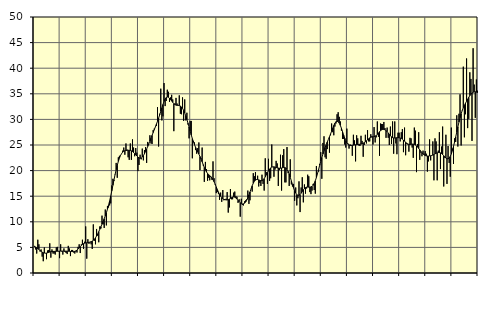
| Category | Piggar | Series 1 |
|---|---|---|
| nan | 5.1 | 5.25 |
| 87.0 | 4.6 | 5.07 |
| 87.0 | 3.8 | 4.92 |
| 87.0 | 6.5 | 4.76 |
| 87.0 | 5.6 | 4.6 |
| 87.0 | 4.2 | 4.42 |
| 87.0 | 4.6 | 4.23 |
| 87.0 | 3.2 | 4.08 |
| 87.0 | 2.3 | 3.96 |
| 87.0 | 5 | 3.9 |
| 87.0 | 3.9 | 3.87 |
| 87.0 | 2.7 | 3.89 |
| nan | 4.4 | 3.95 |
| 88.0 | 4.5 | 4.02 |
| 88.0 | 5.8 | 4.1 |
| 88.0 | 3 | 4.17 |
| 88.0 | 4.6 | 4.2 |
| 88.0 | 3.8 | 4.22 |
| 88.0 | 3.8 | 4.22 |
| 88.0 | 3.6 | 4.23 |
| 88.0 | 5 | 4.24 |
| 88.0 | 5.1 | 4.25 |
| 88.0 | 4.2 | 4.26 |
| 88.0 | 2.9 | 4.27 |
| nan | 5.6 | 4.28 |
| 89.0 | 4.2 | 4.29 |
| 89.0 | 3.6 | 4.28 |
| 89.0 | 4.8 | 4.27 |
| 89.0 | 4.1 | 4.27 |
| 89.0 | 3.9 | 4.27 |
| 89.0 | 3.7 | 4.26 |
| 89.0 | 5.3 | 4.25 |
| 89.0 | 4.8 | 4.24 |
| 89.0 | 3.3 | 4.21 |
| 89.0 | 4.5 | 4.19 |
| 89.0 | 4.5 | 4.18 |
| nan | 4 | 4.19 |
| 90.0 | 3.8 | 4.23 |
| 90.0 | 4.2 | 4.32 |
| 90.0 | 4 | 4.47 |
| 90.0 | 5.1 | 4.67 |
| 90.0 | 5.6 | 4.91 |
| 90.0 | 3.9 | 5.16 |
| 90.0 | 5.6 | 5.39 |
| 90.0 | 6.5 | 5.58 |
| 90.0 | 4.7 | 5.72 |
| 90.0 | 6.1 | 5.82 |
| 90.0 | 9.1 | 5.87 |
| nan | 2.8 | 5.91 |
| 91.0 | 6.6 | 5.94 |
| 91.0 | 5.7 | 5.99 |
| 91.0 | 6 | 6.04 |
| 91.0 | 5.6 | 6.12 |
| 91.0 | 4.7 | 6.23 |
| 91.0 | 9.5 | 6.38 |
| 91.0 | 6.3 | 6.6 |
| 91.0 | 5.6 | 6.88 |
| 91.0 | 8.6 | 7.23 |
| 91.0 | 7.3 | 7.63 |
| 91.0 | 6 | 8.08 |
| nan | 9.1 | 8.55 |
| 92.0 | 8.7 | 9.05 |
| 92.0 | 11.2 | 9.56 |
| 92.0 | 9.5 | 10.07 |
| 92.0 | 8.8 | 10.59 |
| 92.0 | 12.4 | 11.16 |
| 92.0 | 9.3 | 11.78 |
| 92.0 | 13.1 | 12.46 |
| 92.0 | 12.8 | 13.23 |
| 92.0 | 13.2 | 14.09 |
| 92.0 | 13.6 | 15.04 |
| 92.0 | 17.1 | 16.06 |
| nan | 18.4 | 17.13 |
| 93.0 | 18 | 18.2 |
| 93.0 | 19.3 | 19.22 |
| 93.0 | 21.5 | 20.17 |
| 93.0 | 18.6 | 21.04 |
| 93.0 | 22.6 | 21.79 |
| 93.0 | 22.9 | 22.43 |
| 93.0 | 22.9 | 22.95 |
| 93.0 | 23.3 | 23.33 |
| 93.0 | 23.9 | 23.61 |
| 93.0 | 24.5 | 23.79 |
| 93.0 | 23.1 | 23.88 |
| nan | 25.3 | 23.93 |
| 94.0 | 24.1 | 23.96 |
| 94.0 | 22.6 | 23.97 |
| 94.0 | 22.1 | 23.97 |
| 94.0 | 25.3 | 23.93 |
| 94.0 | 22.1 | 23.86 |
| 94.0 | 26.1 | 23.72 |
| 94.0 | 24.5 | 23.54 |
| 94.0 | 22.8 | 23.32 |
| 94.0 | 24.4 | 23.08 |
| 94.0 | 23.5 | 22.85 |
| 94.0 | 19.9 | 22.64 |
| nan | 21.1 | 22.48 |
| 95.0 | 23.1 | 22.42 |
| 95.0 | 22.2 | 22.46 |
| 95.0 | 24.3 | 22.64 |
| 95.0 | 22 | 22.92 |
| 95.0 | 24 | 23.29 |
| 95.0 | 24.6 | 23.72 |
| 95.0 | 21.5 | 24.2 |
| 95.0 | 25.6 | 24.72 |
| 95.0 | 25.1 | 25.24 |
| 95.0 | 26.9 | 25.77 |
| 95.0 | 25.3 | 26.32 |
| nan | 25.2 | 26.88 |
| 96.0 | 27.9 | 27.43 |
| 96.0 | 28.2 | 27.98 |
| 96.0 | 28.5 | 28.53 |
| 96.0 | 28.7 | 29.07 |
| 96.0 | 32.4 | 29.64 |
| 96.0 | 24.7 | 30.25 |
| 96.0 | 31.1 | 30.89 |
| 96.0 | 36 | 31.56 |
| 96.0 | 29.8 | 32.24 |
| 96.0 | 30.6 | 32.91 |
| 96.0 | 37.1 | 33.51 |
| nan | 32.6 | 33.97 |
| 97.0 | 33.6 | 34.27 |
| 97.0 | 35.8 | 34.38 |
| 97.0 | 35.4 | 34.32 |
| 97.0 | 33.4 | 34.14 |
| 97.0 | 34.3 | 33.88 |
| 97.0 | 34.8 | 33.59 |
| 97.0 | 33.9 | 33.33 |
| 97.0 | 27.7 | 33.08 |
| 97.0 | 33.1 | 32.89 |
| 97.0 | 34.2 | 32.79 |
| 97.0 | 33.1 | 32.75 |
| nan | 32.8 | 32.74 |
| 98.0 | 34.7 | 32.7 |
| 98.0 | 31.1 | 32.61 |
| 98.0 | 31 | 32.44 |
| 98.0 | 34.3 | 32.16 |
| 98.0 | 29.7 | 31.76 |
| 98.0 | 33.9 | 31.26 |
| 98.0 | 29.8 | 30.65 |
| 98.0 | 31.3 | 29.98 |
| 98.0 | 29 | 29.26 |
| 98.0 | 26.3 | 28.51 |
| 98.0 | 29.7 | 27.74 |
| nan | 29.7 | 26.97 |
| 99.0 | 22.4 | 26.26 |
| 99.0 | 25.8 | 25.61 |
| 99.0 | 25.5 | 25.05 |
| 99.0 | 24 | 24.54 |
| 99.0 | 23.3 | 24.08 |
| 99.0 | 24.4 | 23.65 |
| 99.0 | 25.5 | 23.22 |
| 99.0 | 20.1 | 22.76 |
| 99.0 | 22.4 | 22.26 |
| 99.0 | 24.5 | 21.72 |
| 99.0 | 21 | 21.16 |
| nan | 17.8 | 20.61 |
| 0.0 | 21.7 | 20.13 |
| 0.0 | 20.3 | 19.74 |
| 0.0 | 18 | 19.44 |
| 0.0 | 18.6 | 19.21 |
| 0.0 | 18.1 | 19.01 |
| 0.0 | 18.9 | 18.8 |
| 0.0 | 18.2 | 18.54 |
| 0.0 | 21.8 | 18.21 |
| 0.0 | 18.5 | 17.81 |
| 0.0 | 17.2 | 17.33 |
| 0.0 | 15.6 | 16.8 |
| nan | 15.8 | 16.29 |
| 1.0 | 15.4 | 15.8 |
| 1.0 | 14.3 | 15.36 |
| 1.0 | 15.7 | 15 |
| 1.0 | 13.9 | 14.72 |
| 1.0 | 16.2 | 14.52 |
| 1.0 | 14.2 | 14.4 |
| 1.0 | 14.3 | 14.32 |
| 1.0 | 14.5 | 14.28 |
| 1.0 | 15.8 | 14.27 |
| 1.0 | 11.8 | 14.33 |
| 1.0 | 12.8 | 14.44 |
| nan | 16.4 | 14.58 |
| 2.0 | 14.4 | 14.72 |
| 2.0 | 14.4 | 14.82 |
| 2.0 | 15.7 | 14.86 |
| 2.0 | 15.9 | 14.81 |
| 2.0 | 15 | 14.66 |
| 2.0 | 14.9 | 14.44 |
| 2.0 | 13.7 | 14.18 |
| 2.0 | 14.4 | 13.92 |
| 2.0 | 11 | 13.7 |
| 2.0 | 14.5 | 13.55 |
| 2.0 | 13.3 | 13.48 |
| nan | 13.2 | 13.51 |
| 3.0 | 14 | 13.63 |
| 3.0 | 14.2 | 13.87 |
| 3.0 | 14.4 | 14.23 |
| 3.0 | 16.1 | 14.69 |
| 3.0 | 13.5 | 15.24 |
| 3.0 | 14.2 | 15.83 |
| 3.0 | 16.4 | 16.44 |
| 3.0 | 15.9 | 17.03 |
| 3.0 | 19.5 | 17.53 |
| 3.0 | 18.9 | 17.91 |
| 3.0 | 19.7 | 18.15 |
| nan | 18.2 | 18.25 |
| 4.0 | 19 | 18.25 |
| 4.0 | 16.9 | 18.19 |
| 4.0 | 17.6 | 18.1 |
| 4.0 | 17 | 18.03 |
| 4.0 | 19.2 | 18.05 |
| 4.0 | 17.4 | 18.19 |
| 4.0 | 16.1 | 18.44 |
| 4.0 | 22.4 | 18.78 |
| 4.0 | 19.7 | 19.18 |
| 4.0 | 17.4 | 19.6 |
| 4.0 | 22.3 | 19.97 |
| nan | 18 | 20.3 |
| 5.0 | 18.5 | 20.54 |
| 5.0 | 25.1 | 20.68 |
| 5.0 | 20.7 | 20.73 |
| 5.0 | 18.8 | 20.73 |
| 5.0 | 20.2 | 20.69 |
| 5.0 | 21.9 | 20.61 |
| 5.0 | 21.4 | 20.55 |
| 5.0 | 17 | 20.5 |
| 5.0 | 20.1 | 20.46 |
| 5.0 | 23.1 | 20.47 |
| 5.0 | 16.1 | 20.51 |
| nan | 23 | 20.57 |
| 6.0 | 24.2 | 20.62 |
| 6.0 | 17.7 | 20.61 |
| 6.0 | 17.7 | 20.49 |
| 6.0 | 24.6 | 20.24 |
| 6.0 | 19.5 | 19.86 |
| 6.0 | 17 | 19.34 |
| 6.0 | 22.2 | 18.69 |
| 6.0 | 17.3 | 17.99 |
| 6.0 | 16.9 | 17.29 |
| 6.0 | 17.4 | 16.63 |
| 6.0 | 14.1 | 16.07 |
| nan | 16.7 | 15.63 |
| 7.0 | 13.2 | 15.31 |
| 7.0 | 14.6 | 15.15 |
| 7.0 | 17.9 | 15.17 |
| 7.0 | 11.9 | 15.34 |
| 7.0 | 16.7 | 15.59 |
| 7.0 | 18.7 | 15.91 |
| 7.0 | 13.8 | 16.23 |
| 7.0 | 17.3 | 16.49 |
| 7.0 | 15.5 | 16.67 |
| 7.0 | 16.5 | 16.77 |
| 7.0 | 19.2 | 16.79 |
| nan | 18.9 | 16.77 |
| 8.0 | 15.8 | 16.76 |
| 8.0 | 15.4 | 16.81 |
| 8.0 | 16.1 | 16.92 |
| 8.0 | 17.4 | 17.14 |
| 8.0 | 16.2 | 17.5 |
| 8.0 | 15.5 | 18.01 |
| 8.0 | 20.9 | 18.65 |
| 8.0 | 19.5 | 19.4 |
| 8.0 | 19.8 | 20.21 |
| 8.0 | 21.3 | 21.03 |
| 8.0 | 23.6 | 21.82 |
| nan | 18.4 | 22.55 |
| 9.0 | 25.4 | 23.24 |
| 9.0 | 26.7 | 23.9 |
| 9.0 | 22.6 | 24.51 |
| 9.0 | 22.3 | 25.07 |
| 9.0 | 24.2 | 25.59 |
| 9.0 | 26.1 | 26.1 |
| 9.0 | 23.5 | 26.61 |
| 9.0 | 26.9 | 27.14 |
| 9.0 | 29.2 | 27.71 |
| 9.0 | 27.5 | 28.28 |
| 9.0 | 26.9 | 28.82 |
| nan | 28.6 | 29.26 |
| 10.0 | 29.2 | 29.56 |
| 10.0 | 31 | 29.65 |
| 10.0 | 31.4 | 29.55 |
| 10.0 | 30.5 | 29.26 |
| 10.0 | 29.6 | 28.83 |
| 10.0 | 27.8 | 28.27 |
| 10.0 | 26.2 | 27.63 |
| 10.0 | 26.2 | 26.97 |
| 10.0 | 25.1 | 26.35 |
| 10.0 | 24.5 | 25.82 |
| 10.0 | 28.2 | 25.41 |
| nan | 25.3 | 25.15 |
| 11.0 | 24.3 | 24.99 |
| 11.0 | 25.1 | 24.92 |
| 11.0 | 25 | 24.91 |
| 11.0 | 22.9 | 24.93 |
| 11.0 | 27 | 24.97 |
| 11.0 | 25.9 | 25.01 |
| 11.0 | 21.8 | 25.04 |
| 11.0 | 26.9 | 25.07 |
| 11.0 | 26.3 | 25.1 |
| 11.0 | 24.9 | 25.12 |
| 11.0 | 24.8 | 25.15 |
| nan | 26.8 | 25.18 |
| 12.0 | 25.8 | 25.24 |
| 12.0 | 22.7 | 25.34 |
| 12.0 | 25 | 25.48 |
| 12.0 | 27 | 25.64 |
| 12.0 | 25.3 | 25.82 |
| 12.0 | 27.9 | 26.01 |
| 12.0 | 25.7 | 26.21 |
| 12.0 | 25.7 | 26.39 |
| 12.0 | 27.1 | 26.5 |
| 12.0 | 26.7 | 26.57 |
| 12.0 | 25.1 | 26.6 |
| nan | 28.5 | 26.64 |
| 13.0 | 25.5 | 26.72 |
| 13.0 | 26.5 | 26.86 |
| 13.0 | 29.6 | 27.08 |
| 13.0 | 26.6 | 27.34 |
| 13.0 | 22.9 | 27.59 |
| 13.0 | 29.2 | 27.81 |
| 13.0 | 29.1 | 27.97 |
| 13.0 | 29.1 | 28.05 |
| 13.0 | 29.5 | 28.05 |
| 13.0 | 28.3 | 27.96 |
| 13.0 | 26.4 | 27.82 |
| nan | 28.4 | 27.6 |
| 14.0 | 26.4 | 27.35 |
| 14.0 | 25 | 27.08 |
| 14.0 | 28.6 | 26.81 |
| 14.0 | 25.2 | 26.58 |
| 14.0 | 29.6 | 26.44 |
| 14.0 | 23.3 | 26.38 |
| 14.0 | 29.6 | 26.37 |
| 14.0 | 25.3 | 26.39 |
| 14.0 | 23.2 | 26.42 |
| 14.0 | 27.4 | 26.44 |
| 14.0 | 27.4 | 26.42 |
| nan | 25.7 | 26.36 |
| 15.0 | 27.5 | 26.28 |
| 15.0 | 28.1 | 26.14 |
| 15.0 | 23.6 | 25.95 |
| 15.0 | 28.4 | 25.74 |
| 15.0 | 23 | 25.54 |
| 15.0 | 25.2 | 25.35 |
| 15.0 | 25.1 | 25.21 |
| 15.0 | 23.7 | 25.12 |
| 15.0 | 26.4 | 25.11 |
| 15.0 | 26.3 | 25.15 |
| 15.0 | 24.5 | 25.18 |
| nan | 22.5 | 25.17 |
| 16.0 | 28.4 | 25.11 |
| 16.0 | 27.8 | 24.99 |
| 16.0 | 19.7 | 24.82 |
| 16.0 | 25.2 | 24.6 |
| 16.0 | 27.5 | 24.33 |
| 16.0 | 22.1 | 24.05 |
| 16.0 | 23.5 | 23.75 |
| 16.0 | 22.8 | 23.49 |
| 16.0 | 23.9 | 23.27 |
| 16.0 | 23.3 | 23.08 |
| 16.0 | 23.8 | 22.94 |
| nan | 23.3 | 22.88 |
| 17.0 | 19.8 | 22.85 |
| 17.0 | 21.8 | 22.84 |
| 17.0 | 26.1 | 22.87 |
| 17.0 | 22 | 22.9 |
| 17.0 | 22.9 | 22.96 |
| 17.0 | 25.7 | 23.04 |
| 17.0 | 18.1 | 23.14 |
| 17.0 | 26.3 | 23.26 |
| 17.0 | 25.7 | 23.38 |
| 17.0 | 18.1 | 23.46 |
| 17.0 | 23.9 | 23.53 |
| nan | 27.5 | 23.53 |
| 18.0 | 20.3 | 23.46 |
| 18.0 | 24.7 | 23.33 |
| 18.0 | 28.6 | 23.15 |
| 18.0 | 16.9 | 22.91 |
| 18.0 | 22.5 | 22.66 |
| 18.0 | 27 | 22.45 |
| 18.0 | 17.4 | 22.32 |
| 18.0 | 24.8 | 22.3 |
| 18.0 | 21.5 | 22.43 |
| 18.0 | 18.8 | 22.77 |
| 18.0 | 28.4 | 23.27 |
| nan | 24.3 | 23.92 |
| 19.0 | 21.3 | 24.73 |
| 19.0 | 26.3 | 25.61 |
| 19.0 | 25.6 | 26.56 |
| 19.0 | 30.8 | 27.55 |
| 19.0 | 24.7 | 28.55 |
| 19.0 | 31.1 | 29.47 |
| 19.0 | 34.9 | 30.33 |
| 19.0 | 24.9 | 31.1 |
| 19.0 | 31.8 | 31.73 |
| 19.0 | 40.3 | 32.28 |
| 19.0 | 26.5 | 32.76 |
| nan | 31 | 33.16 |
| 20.0 | 41.9 | 33.55 |
| 20.0 | 28.3 | 33.94 |
| 20.0 | 30.1 | 34.31 |
| 20.0 | 39.2 | 34.64 |
| 20.0 | 37.9 | 34.92 |
| 20.0 | 25.8 | 35.16 |
| 20.0 | 43.9 | 35.3 |
| 20.0 | 36.8 | 35.38 |
| 20.0 | 30.3 | 35.4 |
| 20.0 | 37.8 | 35.33 |
| 20.0 | 35.6 | 35.22 |